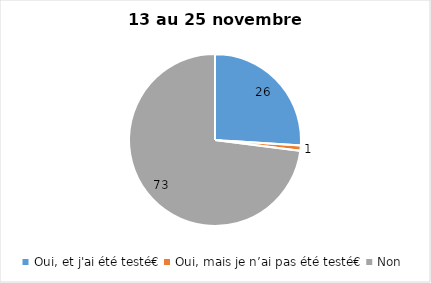
| Category | Series 0 |
|---|---|
| Oui, et j'ai été testé€ | 26 |
| Oui, mais je n’ai pas été testé€ | 1 |
| Non | 73 |